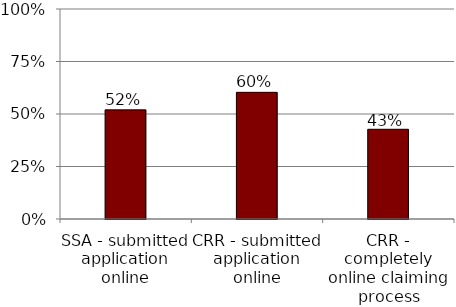
| Category | Series 0 |
|---|---|
| SSA - submitted application online | 0.52 |
| CRR - submitted application online | 0.603 |
| CRR - completely online claiming process | 0.427 |